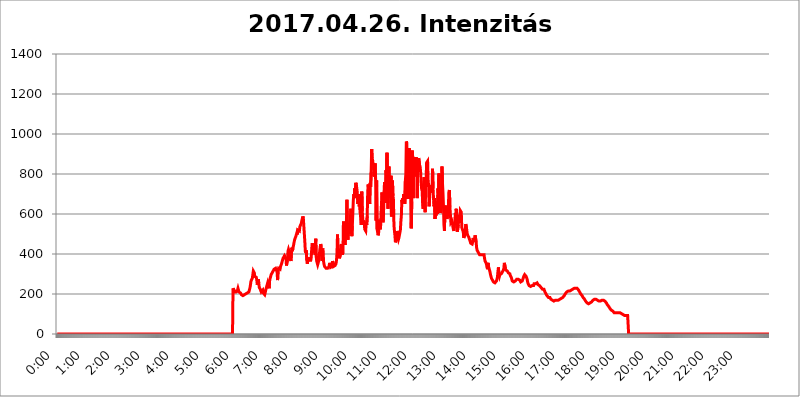
| Category | 2017.04.26. Intenzitás [W/m^2] |
|---|---|
| 0.0 | 0 |
| 0.0006944444444444445 | 0 |
| 0.001388888888888889 | 0 |
| 0.0020833333333333333 | 0 |
| 0.002777777777777778 | 0 |
| 0.003472222222222222 | 0 |
| 0.004166666666666667 | 0 |
| 0.004861111111111111 | 0 |
| 0.005555555555555556 | 0 |
| 0.0062499999999999995 | 0 |
| 0.006944444444444444 | 0 |
| 0.007638888888888889 | 0 |
| 0.008333333333333333 | 0 |
| 0.009027777777777779 | 0 |
| 0.009722222222222222 | 0 |
| 0.010416666666666666 | 0 |
| 0.011111111111111112 | 0 |
| 0.011805555555555555 | 0 |
| 0.012499999999999999 | 0 |
| 0.013194444444444444 | 0 |
| 0.013888888888888888 | 0 |
| 0.014583333333333332 | 0 |
| 0.015277777777777777 | 0 |
| 0.015972222222222224 | 0 |
| 0.016666666666666666 | 0 |
| 0.017361111111111112 | 0 |
| 0.018055555555555557 | 0 |
| 0.01875 | 0 |
| 0.019444444444444445 | 0 |
| 0.02013888888888889 | 0 |
| 0.020833333333333332 | 0 |
| 0.02152777777777778 | 0 |
| 0.022222222222222223 | 0 |
| 0.02291666666666667 | 0 |
| 0.02361111111111111 | 0 |
| 0.024305555555555556 | 0 |
| 0.024999999999999998 | 0 |
| 0.025694444444444447 | 0 |
| 0.02638888888888889 | 0 |
| 0.027083333333333334 | 0 |
| 0.027777777777777776 | 0 |
| 0.02847222222222222 | 0 |
| 0.029166666666666664 | 0 |
| 0.029861111111111113 | 0 |
| 0.030555555555555555 | 0 |
| 0.03125 | 0 |
| 0.03194444444444445 | 0 |
| 0.03263888888888889 | 0 |
| 0.03333333333333333 | 0 |
| 0.034027777777777775 | 0 |
| 0.034722222222222224 | 0 |
| 0.035416666666666666 | 0 |
| 0.036111111111111115 | 0 |
| 0.03680555555555556 | 0 |
| 0.0375 | 0 |
| 0.03819444444444444 | 0 |
| 0.03888888888888889 | 0 |
| 0.03958333333333333 | 0 |
| 0.04027777777777778 | 0 |
| 0.04097222222222222 | 0 |
| 0.041666666666666664 | 0 |
| 0.042361111111111106 | 0 |
| 0.04305555555555556 | 0 |
| 0.043750000000000004 | 0 |
| 0.044444444444444446 | 0 |
| 0.04513888888888889 | 0 |
| 0.04583333333333334 | 0 |
| 0.04652777777777778 | 0 |
| 0.04722222222222222 | 0 |
| 0.04791666666666666 | 0 |
| 0.04861111111111111 | 0 |
| 0.049305555555555554 | 0 |
| 0.049999999999999996 | 0 |
| 0.05069444444444445 | 0 |
| 0.051388888888888894 | 0 |
| 0.052083333333333336 | 0 |
| 0.05277777777777778 | 0 |
| 0.05347222222222222 | 0 |
| 0.05416666666666667 | 0 |
| 0.05486111111111111 | 0 |
| 0.05555555555555555 | 0 |
| 0.05625 | 0 |
| 0.05694444444444444 | 0 |
| 0.057638888888888885 | 0 |
| 0.05833333333333333 | 0 |
| 0.05902777777777778 | 0 |
| 0.059722222222222225 | 0 |
| 0.06041666666666667 | 0 |
| 0.061111111111111116 | 0 |
| 0.06180555555555556 | 0 |
| 0.0625 | 0 |
| 0.06319444444444444 | 0 |
| 0.06388888888888888 | 0 |
| 0.06458333333333334 | 0 |
| 0.06527777777777778 | 0 |
| 0.06597222222222222 | 0 |
| 0.06666666666666667 | 0 |
| 0.06736111111111111 | 0 |
| 0.06805555555555555 | 0 |
| 0.06874999999999999 | 0 |
| 0.06944444444444443 | 0 |
| 0.07013888888888889 | 0 |
| 0.07083333333333333 | 0 |
| 0.07152777777777779 | 0 |
| 0.07222222222222223 | 0 |
| 0.07291666666666667 | 0 |
| 0.07361111111111111 | 0 |
| 0.07430555555555556 | 0 |
| 0.075 | 0 |
| 0.07569444444444444 | 0 |
| 0.0763888888888889 | 0 |
| 0.07708333333333334 | 0 |
| 0.07777777777777778 | 0 |
| 0.07847222222222222 | 0 |
| 0.07916666666666666 | 0 |
| 0.0798611111111111 | 0 |
| 0.08055555555555556 | 0 |
| 0.08125 | 0 |
| 0.08194444444444444 | 0 |
| 0.08263888888888889 | 0 |
| 0.08333333333333333 | 0 |
| 0.08402777777777777 | 0 |
| 0.08472222222222221 | 0 |
| 0.08541666666666665 | 0 |
| 0.08611111111111112 | 0 |
| 0.08680555555555557 | 0 |
| 0.08750000000000001 | 0 |
| 0.08819444444444445 | 0 |
| 0.08888888888888889 | 0 |
| 0.08958333333333333 | 0 |
| 0.09027777777777778 | 0 |
| 0.09097222222222222 | 0 |
| 0.09166666666666667 | 0 |
| 0.09236111111111112 | 0 |
| 0.09305555555555556 | 0 |
| 0.09375 | 0 |
| 0.09444444444444444 | 0 |
| 0.09513888888888888 | 0 |
| 0.09583333333333333 | 0 |
| 0.09652777777777777 | 0 |
| 0.09722222222222222 | 0 |
| 0.09791666666666667 | 0 |
| 0.09861111111111111 | 0 |
| 0.09930555555555555 | 0 |
| 0.09999999999999999 | 0 |
| 0.10069444444444443 | 0 |
| 0.1013888888888889 | 0 |
| 0.10208333333333335 | 0 |
| 0.10277777777777779 | 0 |
| 0.10347222222222223 | 0 |
| 0.10416666666666667 | 0 |
| 0.10486111111111111 | 0 |
| 0.10555555555555556 | 0 |
| 0.10625 | 0 |
| 0.10694444444444444 | 0 |
| 0.1076388888888889 | 0 |
| 0.10833333333333334 | 0 |
| 0.10902777777777778 | 0 |
| 0.10972222222222222 | 0 |
| 0.1111111111111111 | 0 |
| 0.11180555555555556 | 0 |
| 0.11180555555555556 | 0 |
| 0.1125 | 0 |
| 0.11319444444444444 | 0 |
| 0.11388888888888889 | 0 |
| 0.11458333333333333 | 0 |
| 0.11527777777777777 | 0 |
| 0.11597222222222221 | 0 |
| 0.11666666666666665 | 0 |
| 0.1173611111111111 | 0 |
| 0.11805555555555557 | 0 |
| 0.11944444444444445 | 0 |
| 0.12013888888888889 | 0 |
| 0.12083333333333333 | 0 |
| 0.12152777777777778 | 0 |
| 0.12222222222222223 | 0 |
| 0.12291666666666667 | 0 |
| 0.12291666666666667 | 0 |
| 0.12361111111111112 | 0 |
| 0.12430555555555556 | 0 |
| 0.125 | 0 |
| 0.12569444444444444 | 0 |
| 0.12638888888888888 | 0 |
| 0.12708333333333333 | 0 |
| 0.16875 | 0 |
| 0.12847222222222224 | 0 |
| 0.12916666666666668 | 0 |
| 0.12986111111111112 | 0 |
| 0.13055555555555556 | 0 |
| 0.13125 | 0 |
| 0.13194444444444445 | 0 |
| 0.1326388888888889 | 0 |
| 0.13333333333333333 | 0 |
| 0.13402777777777777 | 0 |
| 0.13402777777777777 | 0 |
| 0.13472222222222222 | 0 |
| 0.13541666666666666 | 0 |
| 0.1361111111111111 | 0 |
| 0.13749999999999998 | 0 |
| 0.13819444444444443 | 0 |
| 0.1388888888888889 | 0 |
| 0.13958333333333334 | 0 |
| 0.14027777777777778 | 0 |
| 0.14097222222222222 | 0 |
| 0.14166666666666666 | 0 |
| 0.1423611111111111 | 0 |
| 0.14305555555555557 | 0 |
| 0.14375000000000002 | 0 |
| 0.14444444444444446 | 0 |
| 0.1451388888888889 | 0 |
| 0.1451388888888889 | 0 |
| 0.14652777777777778 | 0 |
| 0.14722222222222223 | 0 |
| 0.14791666666666667 | 0 |
| 0.1486111111111111 | 0 |
| 0.14930555555555555 | 0 |
| 0.15 | 0 |
| 0.15069444444444444 | 0 |
| 0.15138888888888888 | 0 |
| 0.15208333333333332 | 0 |
| 0.15277777777777776 | 0 |
| 0.15347222222222223 | 0 |
| 0.15416666666666667 | 0 |
| 0.15486111111111112 | 0 |
| 0.15555555555555556 | 0 |
| 0.15625 | 0 |
| 0.15694444444444444 | 0 |
| 0.15763888888888888 | 0 |
| 0.15833333333333333 | 0 |
| 0.15902777777777777 | 0 |
| 0.15972222222222224 | 0 |
| 0.16041666666666668 | 0 |
| 0.16111111111111112 | 0 |
| 0.16180555555555556 | 0 |
| 0.1625 | 0 |
| 0.16319444444444445 | 0 |
| 0.1638888888888889 | 0 |
| 0.16458333333333333 | 0 |
| 0.16527777777777777 | 0 |
| 0.16597222222222222 | 0 |
| 0.16666666666666666 | 0 |
| 0.1673611111111111 | 0 |
| 0.16805555555555554 | 0 |
| 0.16874999999999998 | 0 |
| 0.16944444444444443 | 0 |
| 0.17013888888888887 | 0 |
| 0.1708333333333333 | 0 |
| 0.17152777777777775 | 0 |
| 0.17222222222222225 | 0 |
| 0.1729166666666667 | 0 |
| 0.17361111111111113 | 0 |
| 0.17430555555555557 | 0 |
| 0.17500000000000002 | 0 |
| 0.17569444444444446 | 0 |
| 0.1763888888888889 | 0 |
| 0.17708333333333334 | 0 |
| 0.17777777777777778 | 0 |
| 0.17847222222222223 | 0 |
| 0.17916666666666667 | 0 |
| 0.1798611111111111 | 0 |
| 0.18055555555555555 | 0 |
| 0.18125 | 0 |
| 0.18194444444444444 | 0 |
| 0.1826388888888889 | 0 |
| 0.18333333333333335 | 0 |
| 0.1840277777777778 | 0 |
| 0.18472222222222223 | 0 |
| 0.18541666666666667 | 0 |
| 0.18611111111111112 | 0 |
| 0.18680555555555556 | 0 |
| 0.1875 | 0 |
| 0.18819444444444444 | 0 |
| 0.18888888888888888 | 0 |
| 0.18958333333333333 | 0 |
| 0.19027777777777777 | 0 |
| 0.1909722222222222 | 0 |
| 0.19166666666666665 | 0 |
| 0.19236111111111112 | 0 |
| 0.19305555555555554 | 0 |
| 0.19375 | 0 |
| 0.19444444444444445 | 0 |
| 0.1951388888888889 | 0 |
| 0.19583333333333333 | 0 |
| 0.19652777777777777 | 0 |
| 0.19722222222222222 | 0 |
| 0.19791666666666666 | 0 |
| 0.1986111111111111 | 0 |
| 0.19930555555555554 | 0 |
| 0.19999999999999998 | 0 |
| 0.20069444444444443 | 0 |
| 0.20138888888888887 | 0 |
| 0.2020833333333333 | 0 |
| 0.2027777777777778 | 0 |
| 0.2034722222222222 | 0 |
| 0.2041666666666667 | 0 |
| 0.20486111111111113 | 0 |
| 0.20555555555555557 | 0 |
| 0.20625000000000002 | 0 |
| 0.20694444444444446 | 0 |
| 0.2076388888888889 | 0 |
| 0.20833333333333334 | 0 |
| 0.20902777777777778 | 0 |
| 0.20972222222222223 | 0 |
| 0.21041666666666667 | 0 |
| 0.2111111111111111 | 0 |
| 0.21180555555555555 | 0 |
| 0.2125 | 0 |
| 0.21319444444444444 | 0 |
| 0.2138888888888889 | 0 |
| 0.21458333333333335 | 0 |
| 0.2152777777777778 | 0 |
| 0.21597222222222223 | 0 |
| 0.21666666666666667 | 0 |
| 0.21736111111111112 | 0 |
| 0.21805555555555556 | 0 |
| 0.21875 | 0 |
| 0.21944444444444444 | 0 |
| 0.22013888888888888 | 0 |
| 0.22083333333333333 | 0 |
| 0.22152777777777777 | 0 |
| 0.2222222222222222 | 0 |
| 0.22291666666666665 | 0 |
| 0.2236111111111111 | 0 |
| 0.22430555555555556 | 0 |
| 0.225 | 0 |
| 0.22569444444444445 | 0 |
| 0.2263888888888889 | 0 |
| 0.22708333333333333 | 0 |
| 0.22777777777777777 | 0 |
| 0.22847222222222222 | 0 |
| 0.22916666666666666 | 0 |
| 0.2298611111111111 | 0 |
| 0.23055555555555554 | 0 |
| 0.23124999999999998 | 0 |
| 0.23194444444444443 | 0 |
| 0.23263888888888887 | 0 |
| 0.2333333333333333 | 0 |
| 0.2340277777777778 | 0 |
| 0.2347222222222222 | 0 |
| 0.2354166666666667 | 0 |
| 0.23611111111111113 | 0 |
| 0.23680555555555557 | 0 |
| 0.23750000000000002 | 0 |
| 0.23819444444444446 | 0 |
| 0.2388888888888889 | 0 |
| 0.23958333333333334 | 0 |
| 0.24027777777777778 | 0 |
| 0.24097222222222223 | 0 |
| 0.24166666666666667 | 0 |
| 0.2423611111111111 | 0 |
| 0.24305555555555555 | 0 |
| 0.24375 | 0 |
| 0.24444444444444446 | 0 |
| 0.24513888888888888 | 0 |
| 0.24583333333333335 | 0 |
| 0.2465277777777778 | 228.436 |
| 0.24722222222222223 | 228.436 |
| 0.24791666666666667 | 219.309 |
| 0.24861111111111112 | 210.182 |
| 0.24930555555555556 | 205.62 |
| 0.25 | 205.62 |
| 0.25069444444444444 | 210.182 |
| 0.2513888888888889 | 210.182 |
| 0.2520833333333333 | 214.746 |
| 0.25277777777777777 | 219.309 |
| 0.2534722222222222 | 228.436 |
| 0.25416666666666665 | 219.309 |
| 0.2548611111111111 | 210.182 |
| 0.2555555555555556 | 210.182 |
| 0.25625000000000003 | 205.62 |
| 0.2569444444444445 | 205.62 |
| 0.2576388888888889 | 201.058 |
| 0.25833333333333336 | 196.497 |
| 0.2590277777777778 | 191.937 |
| 0.25972222222222224 | 191.937 |
| 0.2604166666666667 | 191.937 |
| 0.2611111111111111 | 196.497 |
| 0.26180555555555557 | 196.497 |
| 0.2625 | 196.497 |
| 0.26319444444444445 | 196.497 |
| 0.2638888888888889 | 201.058 |
| 0.26458333333333334 | 201.058 |
| 0.2652777777777778 | 201.058 |
| 0.2659722222222222 | 205.62 |
| 0.26666666666666666 | 205.62 |
| 0.2673611111111111 | 205.62 |
| 0.26805555555555555 | 210.182 |
| 0.26875 | 210.182 |
| 0.26944444444444443 | 219.309 |
| 0.2701388888888889 | 228.436 |
| 0.2708333333333333 | 242.127 |
| 0.27152777777777776 | 260.373 |
| 0.2722222222222222 | 269.49 |
| 0.27291666666666664 | 269.49 |
| 0.2736111111111111 | 278.603 |
| 0.2743055555555555 | 283.156 |
| 0.27499999999999997 | 314.98 |
| 0.27569444444444446 | 314.98 |
| 0.27638888888888885 | 305.898 |
| 0.27708333333333335 | 287.709 |
| 0.2777777777777778 | 283.156 |
| 0.27847222222222223 | 287.709 |
| 0.2791666666666667 | 283.156 |
| 0.2798611111111111 | 269.49 |
| 0.28055555555555556 | 246.689 |
| 0.28125 | 260.373 |
| 0.28194444444444444 | 274.047 |
| 0.2826388888888889 | 255.813 |
| 0.2833333333333333 | 233 |
| 0.28402777777777777 | 228.436 |
| 0.2847222222222222 | 223.873 |
| 0.28541666666666665 | 223.873 |
| 0.28611111111111115 | 210.182 |
| 0.28680555555555554 | 205.62 |
| 0.28750000000000003 | 210.182 |
| 0.2881944444444445 | 219.309 |
| 0.2888888888888889 | 205.62 |
| 0.28958333333333336 | 201.058 |
| 0.2902777777777778 | 210.182 |
| 0.29097222222222224 | 196.497 |
| 0.2916666666666667 | 205.62 |
| 0.2923611111111111 | 219.309 |
| 0.29305555555555557 | 228.436 |
| 0.29375 | 237.564 |
| 0.29444444444444445 | 246.689 |
| 0.2951388888888889 | 255.813 |
| 0.29583333333333334 | 246.689 |
| 0.2965277777777778 | 246.689 |
| 0.2972222222222222 | 228.436 |
| 0.29791666666666666 | 269.49 |
| 0.2986111111111111 | 274.047 |
| 0.29930555555555555 | 269.49 |
| 0.3 | 296.808 |
| 0.30069444444444443 | 301.354 |
| 0.3013888888888889 | 305.898 |
| 0.3020833333333333 | 310.44 |
| 0.30277777777777776 | 314.98 |
| 0.3034722222222222 | 319.517 |
| 0.30416666666666664 | 324.052 |
| 0.3048611111111111 | 324.052 |
| 0.3055555555555555 | 324.052 |
| 0.30624999999999997 | 328.584 |
| 0.3069444444444444 | 333.113 |
| 0.3076388888888889 | 333.113 |
| 0.30833333333333335 | 310.44 |
| 0.3090277777777778 | 269.49 |
| 0.30972222222222223 | 319.517 |
| 0.3104166666666667 | 328.584 |
| 0.3111111111111111 | 333.113 |
| 0.31180555555555556 | 333.113 |
| 0.3125 | 324.052 |
| 0.31319444444444444 | 337.639 |
| 0.3138888888888889 | 342.162 |
| 0.3145833333333333 | 351.198 |
| 0.31527777777777777 | 351.198 |
| 0.3159722222222222 | 369.23 |
| 0.31666666666666665 | 378.224 |
| 0.31736111111111115 | 382.715 |
| 0.31805555555555554 | 382.715 |
| 0.31875000000000003 | 391.685 |
| 0.3194444444444445 | 396.164 |
| 0.3201388888888889 | 387.202 |
| 0.32083333333333336 | 378.224 |
| 0.3215277777777778 | 342.162 |
| 0.32222222222222224 | 342.162 |
| 0.3229166666666667 | 373.729 |
| 0.3236111111111111 | 414.035 |
| 0.32430555555555557 | 422.943 |
| 0.325 | 414.035 |
| 0.32569444444444445 | 414.035 |
| 0.3263888888888889 | 396.164 |
| 0.32708333333333334 | 373.729 |
| 0.3277777777777778 | 364.728 |
| 0.3284722222222222 | 409.574 |
| 0.32916666666666666 | 431.833 |
| 0.3298611111111111 | 414.035 |
| 0.33055555555555555 | 431.833 |
| 0.33125 | 440.702 |
| 0.33194444444444443 | 445.129 |
| 0.3326388888888889 | 467.187 |
| 0.3333333333333333 | 475.972 |
| 0.3340277777777778 | 480.356 |
| 0.3347222222222222 | 489.108 |
| 0.3354166666666667 | 497.836 |
| 0.3361111111111111 | 506.542 |
| 0.3368055555555556 | 497.836 |
| 0.33749999999999997 | 519.555 |
| 0.33819444444444446 | 519.555 |
| 0.33888888888888885 | 519.555 |
| 0.33958333333333335 | 515.223 |
| 0.34027777777777773 | 536.82 |
| 0.34097222222222223 | 541.121 |
| 0.3416666666666666 | 536.82 |
| 0.3423611111111111 | 553.986 |
| 0.3430555555555555 | 566.793 |
| 0.34375 | 571.049 |
| 0.3444444444444445 | 588.009 |
| 0.3451388888888889 | 579.542 |
| 0.3458333333333334 | 579.542 |
| 0.34652777777777777 | 575.299 |
| 0.34722222222222227 | 462.786 |
| 0.34791666666666665 | 414.035 |
| 0.34861111111111115 | 405.108 |
| 0.34930555555555554 | 418.492 |
| 0.35000000000000003 | 369.23 |
| 0.3506944444444444 | 351.198 |
| 0.3513888888888889 | 364.728 |
| 0.3520833333333333 | 382.715 |
| 0.3527777777777778 | 387.202 |
| 0.3534722222222222 | 369.23 |
| 0.3541666666666667 | 364.728 |
| 0.3548611111111111 | 373.729 |
| 0.35555555555555557 | 369.23 |
| 0.35625 | 382.715 |
| 0.35694444444444445 | 427.39 |
| 0.3576388888888889 | 453.968 |
| 0.35833333333333334 | 436.27 |
| 0.3590277777777778 | 422.943 |
| 0.3597222222222222 | 440.702 |
| 0.36041666666666666 | 445.129 |
| 0.3611111111111111 | 405.108 |
| 0.36180555555555555 | 396.164 |
| 0.3625 | 475.972 |
| 0.36319444444444443 | 387.202 |
| 0.3638888888888889 | 364.728 |
| 0.3645833333333333 | 355.712 |
| 0.3652777777777778 | 346.682 |
| 0.3659722222222222 | 346.682 |
| 0.3666666666666667 | 351.198 |
| 0.3673611111111111 | 373.729 |
| 0.3680555555555556 | 414.035 |
| 0.36874999999999997 | 431.833 |
| 0.36944444444444446 | 449.551 |
| 0.37013888888888885 | 440.702 |
| 0.37083333333333335 | 400.638 |
| 0.37152777777777773 | 364.728 |
| 0.37222222222222223 | 427.39 |
| 0.3729166666666666 | 405.108 |
| 0.3736111111111111 | 360.221 |
| 0.3743055555555555 | 346.682 |
| 0.375 | 337.639 |
| 0.3756944444444445 | 342.162 |
| 0.3763888888888889 | 337.639 |
| 0.3770833333333334 | 328.584 |
| 0.37777777777777777 | 333.113 |
| 0.37847222222222227 | 333.113 |
| 0.37916666666666665 | 328.584 |
| 0.37986111111111115 | 333.113 |
| 0.38055555555555554 | 333.113 |
| 0.38125000000000003 | 337.639 |
| 0.3819444444444444 | 355.712 |
| 0.3826388888888889 | 342.162 |
| 0.3833333333333333 | 333.113 |
| 0.3840277777777778 | 333.113 |
| 0.3847222222222222 | 337.639 |
| 0.3854166666666667 | 337.639 |
| 0.3861111111111111 | 364.728 |
| 0.38680555555555557 | 355.712 |
| 0.3875 | 337.639 |
| 0.38819444444444445 | 342.162 |
| 0.3888888888888889 | 342.162 |
| 0.38958333333333334 | 342.162 |
| 0.3902777777777778 | 346.682 |
| 0.3909722222222222 | 351.198 |
| 0.39166666666666666 | 369.23 |
| 0.3923611111111111 | 405.108 |
| 0.39305555555555555 | 497.836 |
| 0.39375 | 431.833 |
| 0.39444444444444443 | 422.943 |
| 0.3951388888888889 | 396.164 |
| 0.3958333333333333 | 378.224 |
| 0.3965277777777778 | 373.729 |
| 0.3972222222222222 | 400.638 |
| 0.3979166666666667 | 440.702 |
| 0.3986111111111111 | 449.551 |
| 0.3993055555555556 | 453.968 |
| 0.39999999999999997 | 396.164 |
| 0.40069444444444446 | 409.574 |
| 0.40138888888888885 | 562.53 |
| 0.40208333333333335 | 458.38 |
| 0.40277777777777773 | 532.513 |
| 0.40347222222222223 | 445.129 |
| 0.4041666666666666 | 449.551 |
| 0.4048611111111111 | 440.702 |
| 0.4055555555555555 | 558.261 |
| 0.40625 | 671.22 |
| 0.4069444444444445 | 549.704 |
| 0.4076388888888889 | 471.582 |
| 0.4083333333333334 | 510.885 |
| 0.40902777777777777 | 536.82 |
| 0.40972222222222227 | 502.192 |
| 0.41041666666666665 | 553.986 |
| 0.41111111111111115 | 566.793 |
| 0.41180555555555554 | 625.784 |
| 0.41250000000000003 | 519.555 |
| 0.4131944444444444 | 489.108 |
| 0.4138888888888889 | 541.121 |
| 0.4145833333333333 | 536.82 |
| 0.4152777777777778 | 671.22 |
| 0.4159722222222222 | 699.717 |
| 0.4166666666666667 | 679.395 |
| 0.4173611111111111 | 727.896 |
| 0.41805555555555557 | 707.8 |
| 0.41875 | 755.766 |
| 0.41944444444444445 | 747.834 |
| 0.4201388888888889 | 727.896 |
| 0.42083333333333334 | 707.8 |
| 0.4215277777777778 | 650.667 |
| 0.4222222222222222 | 675.311 |
| 0.42291666666666666 | 699.717 |
| 0.4236111111111111 | 638.256 |
| 0.42430555555555555 | 658.909 |
| 0.425 | 604.864 |
| 0.42569444444444443 | 575.299 |
| 0.4263888888888889 | 545.416 |
| 0.4270833333333333 | 711.832 |
| 0.4277777777777778 | 613.252 |
| 0.4284722222222222 | 579.542 |
| 0.4291666666666667 | 545.416 |
| 0.4298611111111111 | 566.793 |
| 0.4305555555555556 | 553.986 |
| 0.43124999999999997 | 523.88 |
| 0.43194444444444446 | 519.555 |
| 0.43263888888888885 | 515.223 |
| 0.43333333333333335 | 558.261 |
| 0.43402777777777773 | 545.416 |
| 0.43472222222222223 | 588.009 |
| 0.4354166666666666 | 707.8 |
| 0.4361111111111111 | 747.834 |
| 0.4368055555555555 | 747.834 |
| 0.4375 | 691.608 |
| 0.4381944444444445 | 650.667 |
| 0.4388888888888889 | 755.766 |
| 0.4395833333333334 | 735.89 |
| 0.44027777777777777 | 810.641 |
| 0.44097222222222227 | 925.06 |
| 0.44166666666666665 | 879.719 |
| 0.44236111111111115 | 868.305 |
| 0.44305555555555554 | 845.365 |
| 0.44375000000000003 | 853.029 |
| 0.4444444444444444 | 787.258 |
| 0.4451388888888889 | 802.868 |
| 0.4458333333333333 | 853.029 |
| 0.4465277777777778 | 775.492 |
| 0.4472222222222222 | 566.793 |
| 0.4479166666666667 | 767.62 |
| 0.4486111111111111 | 523.88 |
| 0.44930555555555557 | 523.88 |
| 0.45 | 493.475 |
| 0.45069444444444445 | 502.192 |
| 0.4513888888888889 | 558.261 |
| 0.45208333333333334 | 571.049 |
| 0.4527777777777778 | 523.88 |
| 0.4534722222222222 | 532.513 |
| 0.45416666666666666 | 609.062 |
| 0.4548611111111111 | 604.864 |
| 0.45555555555555555 | 707.8 |
| 0.45625 | 596.45 |
| 0.45694444444444443 | 558.261 |
| 0.4576388888888889 | 604.864 |
| 0.4583333333333333 | 707.8 |
| 0.4590277777777778 | 759.723 |
| 0.4597222222222222 | 735.89 |
| 0.4604166666666667 | 654.791 |
| 0.4611111111111111 | 818.392 |
| 0.4618055555555556 | 798.974 |
| 0.46249999999999997 | 906.223 |
| 0.46319444444444446 | 775.492 |
| 0.46388888888888885 | 625.784 |
| 0.46458333333333335 | 735.89 |
| 0.46527777777777773 | 837.682 |
| 0.46597222222222223 | 679.395 |
| 0.4666666666666666 | 775.492 |
| 0.4673611111111111 | 695.666 |
| 0.4680555555555555 | 791.169 |
| 0.46875 | 588.009 |
| 0.4694444444444445 | 650.667 |
| 0.4701388888888889 | 767.62 |
| 0.4708333333333334 | 691.608 |
| 0.47152777777777777 | 671.22 |
| 0.47222222222222227 | 545.416 |
| 0.47291666666666665 | 515.223 |
| 0.47361111111111115 | 493.475 |
| 0.47430555555555554 | 458.38 |
| 0.47500000000000003 | 462.786 |
| 0.4756944444444444 | 475.972 |
| 0.4763888888888889 | 515.223 |
| 0.4770833333333333 | 510.885 |
| 0.4777777777777778 | 480.356 |
| 0.4784722222222222 | 471.582 |
| 0.4791666666666667 | 480.356 |
| 0.4798611111111111 | 484.735 |
| 0.48055555555555557 | 506.542 |
| 0.48125 | 519.555 |
| 0.48194444444444445 | 562.53 |
| 0.4826388888888889 | 592.233 |
| 0.48333333333333334 | 671.22 |
| 0.4840277777777778 | 658.909 |
| 0.4847222222222222 | 679.395 |
| 0.48541666666666666 | 663.019 |
| 0.4861111111111111 | 699.717 |
| 0.48680555555555555 | 675.311 |
| 0.4875 | 650.667 |
| 0.48819444444444443 | 763.674 |
| 0.4888888888888889 | 798.974 |
| 0.4895833333333333 | 962.555 |
| 0.4902777777777778 | 955.071 |
| 0.4909722222222222 | 691.608 |
| 0.4916666666666667 | 675.311 |
| 0.4923611111111111 | 798.974 |
| 0.4930555555555556 | 731.896 |
| 0.49374999999999997 | 928.819 |
| 0.49444444444444446 | 791.169 |
| 0.49513888888888885 | 675.311 |
| 0.49583333333333335 | 791.169 |
| 0.49652777777777773 | 528.2 |
| 0.49722222222222223 | 663.019 |
| 0.4979166666666666 | 917.534 |
| 0.4986111111111111 | 879.719 |
| 0.4993055555555555 | 679.395 |
| 0.5 | 883.516 |
| 0.5006944444444444 | 787.258 |
| 0.5013888888888889 | 860.676 |
| 0.5020833333333333 | 875.918 |
| 0.5027777777777778 | 868.305 |
| 0.5034722222222222 | 883.516 |
| 0.5041666666666667 | 860.676 |
| 0.5048611111111111 | 679.395 |
| 0.5055555555555555 | 856.855 |
| 0.50625 | 860.676 |
| 0.5069444444444444 | 879.719 |
| 0.5076388888888889 | 875.918 |
| 0.5083333333333333 | 841.526 |
| 0.5090277777777777 | 833.834 |
| 0.5097222222222222 | 806.757 |
| 0.5104166666666666 | 751.803 |
| 0.5111111111111112 | 723.889 |
| 0.5118055555555555 | 715.858 |
| 0.5125000000000001 | 650.667 |
| 0.5131944444444444 | 625.784 |
| 0.513888888888889 | 751.803 |
| 0.5145833333333333 | 783.342 |
| 0.5152777777777778 | 642.4 |
| 0.5159722222222222 | 609.062 |
| 0.5166666666666667 | 743.859 |
| 0.517361111111111 | 779.42 |
| 0.5180555555555556 | 856.855 |
| 0.5187499999999999 | 860.676 |
| 0.5194444444444445 | 864.493 |
| 0.5201388888888888 | 771.559 |
| 0.5208333333333334 | 739.877 |
| 0.5215277777777778 | 638.256 |
| 0.5222222222222223 | 675.311 |
| 0.5229166666666667 | 723.889 |
| 0.5236111111111111 | 743.859 |
| 0.5243055555555556 | 747.834 |
| 0.525 | 707.8 |
| 0.5256944444444445 | 739.877 |
| 0.5263888888888889 | 826.123 |
| 0.5270833333333333 | 727.896 |
| 0.5277777777777778 | 675.311 |
| 0.5284722222222222 | 638.256 |
| 0.5291666666666667 | 679.395 |
| 0.5298611111111111 | 575.299 |
| 0.5305555555555556 | 621.613 |
| 0.53125 | 592.233 |
| 0.5319444444444444 | 650.667 |
| 0.5326388888888889 | 663.019 |
| 0.5333333333333333 | 600.661 |
| 0.5340277777777778 | 727.896 |
| 0.5347222222222222 | 699.717 |
| 0.5354166666666667 | 802.868 |
| 0.5361111111111111 | 638.256 |
| 0.5368055555555555 | 638.256 |
| 0.5375 | 604.864 |
| 0.5381944444444444 | 617.436 |
| 0.5388888888888889 | 646.537 |
| 0.5395833333333333 | 837.682 |
| 0.5402777777777777 | 755.766 |
| 0.5409722222222222 | 707.8 |
| 0.5416666666666666 | 642.4 |
| 0.5423611111111112 | 545.416 |
| 0.5430555555555555 | 515.223 |
| 0.5437500000000001 | 629.948 |
| 0.5444444444444444 | 625.784 |
| 0.545138888888889 | 642.4 |
| 0.5458333333333333 | 638.256 |
| 0.5465277777777778 | 575.299 |
| 0.5472222222222222 | 588.009 |
| 0.5479166666666667 | 621.613 |
| 0.548611111111111 | 642.4 |
| 0.5493055555555556 | 711.832 |
| 0.5499999999999999 | 719.877 |
| 0.5506944444444445 | 638.256 |
| 0.5513888888888888 | 642.4 |
| 0.5520833333333334 | 558.261 |
| 0.5527777777777778 | 558.261 |
| 0.5534722222222223 | 566.793 |
| 0.5541666666666667 | 558.261 |
| 0.5548611111111111 | 536.82 |
| 0.5555555555555556 | 523.88 |
| 0.55625 | 515.223 |
| 0.5569444444444445 | 541.121 |
| 0.5576388888888889 | 558.261 |
| 0.5583333333333333 | 604.864 |
| 0.5590277777777778 | 579.542 |
| 0.5597222222222222 | 625.784 |
| 0.5604166666666667 | 545.416 |
| 0.5611111111111111 | 510.885 |
| 0.5618055555555556 | 515.223 |
| 0.5625 | 545.416 |
| 0.5631944444444444 | 596.45 |
| 0.5638888888888889 | 579.542 |
| 0.5645833333333333 | 588.009 |
| 0.5652777777777778 | 617.436 |
| 0.5659722222222222 | 613.252 |
| 0.5666666666666667 | 609.062 |
| 0.5673611111111111 | 532.513 |
| 0.5680555555555555 | 532.513 |
| 0.56875 | 528.2 |
| 0.5694444444444444 | 510.885 |
| 0.5701388888888889 | 480.356 |
| 0.5708333333333333 | 475.972 |
| 0.5715277777777777 | 480.356 |
| 0.5722222222222222 | 502.192 |
| 0.5729166666666666 | 549.704 |
| 0.5736111111111112 | 553.986 |
| 0.5743055555555555 | 519.555 |
| 0.5750000000000001 | 502.192 |
| 0.5756944444444444 | 493.475 |
| 0.576388888888889 | 497.836 |
| 0.5770833333333333 | 484.735 |
| 0.5777777777777778 | 489.108 |
| 0.5784722222222222 | 480.356 |
| 0.5791666666666667 | 462.786 |
| 0.579861111111111 | 453.968 |
| 0.5805555555555556 | 453.968 |
| 0.5812499999999999 | 449.551 |
| 0.5819444444444445 | 449.551 |
| 0.5826388888888888 | 458.38 |
| 0.5833333333333334 | 480.356 |
| 0.5840277777777778 | 475.972 |
| 0.5847222222222223 | 462.786 |
| 0.5854166666666667 | 475.972 |
| 0.5861111111111111 | 493.475 |
| 0.5868055555555556 | 497.836 |
| 0.5875 | 458.38 |
| 0.5881944444444445 | 431.833 |
| 0.5888888888888889 | 418.492 |
| 0.5895833333333333 | 418.492 |
| 0.5902777777777778 | 414.035 |
| 0.5909722222222222 | 405.108 |
| 0.5916666666666667 | 400.638 |
| 0.5923611111111111 | 396.164 |
| 0.5930555555555556 | 396.164 |
| 0.59375 | 396.164 |
| 0.5944444444444444 | 396.164 |
| 0.5951388888888889 | 391.685 |
| 0.5958333333333333 | 391.685 |
| 0.5965277777777778 | 396.164 |
| 0.5972222222222222 | 396.164 |
| 0.5979166666666667 | 400.638 |
| 0.5986111111111111 | 396.164 |
| 0.5993055555555555 | 378.224 |
| 0.6 | 364.728 |
| 0.6006944444444444 | 360.221 |
| 0.6013888888888889 | 355.712 |
| 0.6020833333333333 | 346.682 |
| 0.6027777777777777 | 333.113 |
| 0.6034722222222222 | 324.052 |
| 0.6041666666666666 | 355.712 |
| 0.6048611111111112 | 337.639 |
| 0.6055555555555555 | 328.584 |
| 0.6062500000000001 | 319.517 |
| 0.6069444444444444 | 310.44 |
| 0.607638888888889 | 296.808 |
| 0.6083333333333333 | 287.709 |
| 0.6090277777777778 | 278.603 |
| 0.6097222222222222 | 274.047 |
| 0.6104166666666667 | 269.49 |
| 0.611111111111111 | 264.932 |
| 0.6118055555555556 | 260.373 |
| 0.6124999999999999 | 260.373 |
| 0.6131944444444445 | 255.813 |
| 0.6138888888888888 | 255.813 |
| 0.6145833333333334 | 260.373 |
| 0.6152777777777778 | 260.373 |
| 0.6159722222222223 | 264.932 |
| 0.6166666666666667 | 269.49 |
| 0.6173611111111111 | 283.156 |
| 0.6180555555555556 | 310.44 |
| 0.61875 | 333.113 |
| 0.6194444444444445 | 296.808 |
| 0.6201388888888889 | 287.709 |
| 0.6208333333333333 | 296.808 |
| 0.6215277777777778 | 301.354 |
| 0.6222222222222222 | 301.354 |
| 0.6229166666666667 | 301.354 |
| 0.6236111111111111 | 301.354 |
| 0.6243055555555556 | 310.44 |
| 0.625 | 314.98 |
| 0.6256944444444444 | 319.517 |
| 0.6263888888888889 | 328.584 |
| 0.6270833333333333 | 355.712 |
| 0.6277777777777778 | 360.221 |
| 0.6284722222222222 | 328.584 |
| 0.6291666666666667 | 319.517 |
| 0.6298611111111111 | 314.98 |
| 0.6305555555555555 | 319.517 |
| 0.63125 | 314.98 |
| 0.6319444444444444 | 314.98 |
| 0.6326388888888889 | 305.898 |
| 0.6333333333333333 | 301.354 |
| 0.6340277777777777 | 301.354 |
| 0.6347222222222222 | 301.354 |
| 0.6354166666666666 | 292.259 |
| 0.6361111111111112 | 292.259 |
| 0.6368055555555555 | 283.156 |
| 0.6375000000000001 | 274.047 |
| 0.6381944444444444 | 264.932 |
| 0.638888888888889 | 264.932 |
| 0.6395833333333333 | 260.373 |
| 0.6402777777777778 | 260.373 |
| 0.6409722222222222 | 260.373 |
| 0.6416666666666667 | 260.373 |
| 0.642361111111111 | 264.932 |
| 0.6430555555555556 | 269.49 |
| 0.6437499999999999 | 269.49 |
| 0.6444444444444445 | 274.047 |
| 0.6451388888888888 | 278.603 |
| 0.6458333333333334 | 278.603 |
| 0.6465277777777778 | 274.047 |
| 0.6472222222222223 | 274.047 |
| 0.6479166666666667 | 274.047 |
| 0.6486111111111111 | 269.49 |
| 0.6493055555555556 | 264.932 |
| 0.65 | 260.373 |
| 0.6506944444444445 | 260.373 |
| 0.6513888888888889 | 260.373 |
| 0.6520833333333333 | 264.932 |
| 0.6527777777777778 | 269.49 |
| 0.6534722222222222 | 278.603 |
| 0.6541666666666667 | 287.709 |
| 0.6548611111111111 | 292.259 |
| 0.6555555555555556 | 296.808 |
| 0.65625 | 296.808 |
| 0.6569444444444444 | 292.259 |
| 0.6576388888888889 | 287.709 |
| 0.6583333333333333 | 283.156 |
| 0.6590277777777778 | 274.047 |
| 0.6597222222222222 | 260.373 |
| 0.6604166666666667 | 251.251 |
| 0.6611111111111111 | 246.689 |
| 0.6618055555555555 | 242.127 |
| 0.6625 | 237.564 |
| 0.6631944444444444 | 237.564 |
| 0.6638888888888889 | 237.564 |
| 0.6645833333333333 | 233 |
| 0.6652777777777777 | 233 |
| 0.6659722222222222 | 242.127 |
| 0.6666666666666666 | 242.127 |
| 0.6673611111111111 | 242.127 |
| 0.6680555555555556 | 242.127 |
| 0.6687500000000001 | 251.251 |
| 0.6694444444444444 | 246.689 |
| 0.6701388888888888 | 251.251 |
| 0.6708333333333334 | 251.251 |
| 0.6715277777777778 | 251.251 |
| 0.6722222222222222 | 255.813 |
| 0.6729166666666666 | 255.813 |
| 0.6736111111111112 | 251.251 |
| 0.6743055555555556 | 246.689 |
| 0.6749999999999999 | 246.689 |
| 0.6756944444444444 | 242.127 |
| 0.6763888888888889 | 242.127 |
| 0.6770833333333334 | 242.127 |
| 0.6777777777777777 | 237.564 |
| 0.6784722222222223 | 233 |
| 0.6791666666666667 | 233 |
| 0.6798611111111111 | 228.436 |
| 0.6805555555555555 | 223.873 |
| 0.68125 | 219.309 |
| 0.6819444444444445 | 223.873 |
| 0.6826388888888889 | 223.873 |
| 0.6833333333333332 | 219.309 |
| 0.6840277777777778 | 210.182 |
| 0.6847222222222222 | 210.182 |
| 0.6854166666666667 | 201.058 |
| 0.686111111111111 | 196.497 |
| 0.6868055555555556 | 191.937 |
| 0.6875 | 187.378 |
| 0.6881944444444444 | 187.378 |
| 0.688888888888889 | 182.82 |
| 0.6895833333333333 | 182.82 |
| 0.6902777777777778 | 178.264 |
| 0.6909722222222222 | 182.82 |
| 0.6916666666666668 | 178.264 |
| 0.6923611111111111 | 173.709 |
| 0.6930555555555555 | 173.709 |
| 0.69375 | 169.156 |
| 0.6944444444444445 | 169.156 |
| 0.6951388888888889 | 169.156 |
| 0.6958333333333333 | 169.156 |
| 0.6965277777777777 | 164.605 |
| 0.6972222222222223 | 169.156 |
| 0.6979166666666666 | 169.156 |
| 0.6986111111111111 | 169.156 |
| 0.6993055555555556 | 169.156 |
| 0.7000000000000001 | 169.156 |
| 0.7006944444444444 | 169.156 |
| 0.7013888888888888 | 169.156 |
| 0.7020833333333334 | 169.156 |
| 0.7027777777777778 | 169.156 |
| 0.7034722222222222 | 173.709 |
| 0.7041666666666666 | 173.709 |
| 0.7048611111111112 | 173.709 |
| 0.7055555555555556 | 173.709 |
| 0.7062499999999999 | 178.264 |
| 0.7069444444444444 | 178.264 |
| 0.7076388888888889 | 182.82 |
| 0.7083333333333334 | 182.82 |
| 0.7090277777777777 | 182.82 |
| 0.7097222222222223 | 187.378 |
| 0.7104166666666667 | 187.378 |
| 0.7111111111111111 | 191.937 |
| 0.7118055555555555 | 196.497 |
| 0.7125 | 201.058 |
| 0.7131944444444445 | 201.058 |
| 0.7138888888888889 | 205.62 |
| 0.7145833333333332 | 210.182 |
| 0.7152777777777778 | 210.182 |
| 0.7159722222222222 | 210.182 |
| 0.7166666666666667 | 214.746 |
| 0.717361111111111 | 214.746 |
| 0.7180555555555556 | 214.746 |
| 0.71875 | 214.746 |
| 0.7194444444444444 | 214.746 |
| 0.720138888888889 | 219.309 |
| 0.7208333333333333 | 219.309 |
| 0.7215277777777778 | 219.309 |
| 0.7222222222222222 | 219.309 |
| 0.7229166666666668 | 223.873 |
| 0.7236111111111111 | 223.873 |
| 0.7243055555555555 | 223.873 |
| 0.725 | 228.436 |
| 0.7256944444444445 | 228.436 |
| 0.7263888888888889 | 228.436 |
| 0.7270833333333333 | 228.436 |
| 0.7277777777777777 | 228.436 |
| 0.7284722222222223 | 228.436 |
| 0.7291666666666666 | 228.436 |
| 0.7298611111111111 | 223.873 |
| 0.7305555555555556 | 223.873 |
| 0.7312500000000001 | 219.309 |
| 0.7319444444444444 | 214.746 |
| 0.7326388888888888 | 210.182 |
| 0.7333333333333334 | 205.62 |
| 0.7340277777777778 | 201.058 |
| 0.7347222222222222 | 201.058 |
| 0.7354166666666666 | 196.497 |
| 0.7361111111111112 | 191.937 |
| 0.7368055555555556 | 187.378 |
| 0.7374999999999999 | 182.82 |
| 0.7381944444444444 | 182.82 |
| 0.7388888888888889 | 178.264 |
| 0.7395833333333334 | 173.709 |
| 0.7402777777777777 | 169.156 |
| 0.7409722222222223 | 164.605 |
| 0.7416666666666667 | 164.605 |
| 0.7423611111111111 | 160.056 |
| 0.7430555555555555 | 155.509 |
| 0.74375 | 155.509 |
| 0.7444444444444445 | 150.964 |
| 0.7451388888888889 | 150.964 |
| 0.7458333333333332 | 150.964 |
| 0.7465277777777778 | 150.964 |
| 0.7472222222222222 | 155.509 |
| 0.7479166666666667 | 155.509 |
| 0.748611111111111 | 155.509 |
| 0.7493055555555556 | 160.056 |
| 0.75 | 164.605 |
| 0.7506944444444444 | 164.605 |
| 0.751388888888889 | 169.156 |
| 0.7520833333333333 | 169.156 |
| 0.7527777777777778 | 169.156 |
| 0.7534722222222222 | 173.709 |
| 0.7541666666666668 | 173.709 |
| 0.7548611111111111 | 173.709 |
| 0.7555555555555555 | 173.709 |
| 0.75625 | 173.709 |
| 0.7569444444444445 | 169.156 |
| 0.7576388888888889 | 169.156 |
| 0.7583333333333333 | 169.156 |
| 0.7590277777777777 | 169.156 |
| 0.7597222222222223 | 164.605 |
| 0.7604166666666666 | 164.605 |
| 0.7611111111111111 | 164.605 |
| 0.7618055555555556 | 164.605 |
| 0.7625000000000001 | 164.605 |
| 0.7631944444444444 | 169.156 |
| 0.7638888888888888 | 169.156 |
| 0.7645833333333334 | 169.156 |
| 0.7652777777777778 | 169.156 |
| 0.7659722222222222 | 169.156 |
| 0.7666666666666666 | 164.605 |
| 0.7673611111111112 | 164.605 |
| 0.7680555555555556 | 164.605 |
| 0.7687499999999999 | 160.056 |
| 0.7694444444444444 | 160.056 |
| 0.7701388888888889 | 155.509 |
| 0.7708333333333334 | 150.964 |
| 0.7715277777777777 | 146.423 |
| 0.7722222222222223 | 146.423 |
| 0.7729166666666667 | 141.884 |
| 0.7736111111111111 | 137.347 |
| 0.7743055555555555 | 132.814 |
| 0.775 | 128.284 |
| 0.7756944444444445 | 128.284 |
| 0.7763888888888889 | 123.758 |
| 0.7770833333333332 | 119.235 |
| 0.7777777777777778 | 119.235 |
| 0.7784722222222222 | 114.716 |
| 0.7791666666666667 | 114.716 |
| 0.779861111111111 | 110.201 |
| 0.7805555555555556 | 110.201 |
| 0.78125 | 105.69 |
| 0.7819444444444444 | 105.69 |
| 0.782638888888889 | 105.69 |
| 0.7833333333333333 | 105.69 |
| 0.7840277777777778 | 105.69 |
| 0.7847222222222222 | 105.69 |
| 0.7854166666666668 | 105.69 |
| 0.7861111111111111 | 105.69 |
| 0.7868055555555555 | 105.69 |
| 0.7875 | 105.69 |
| 0.7881944444444445 | 105.69 |
| 0.7888888888888889 | 105.69 |
| 0.7895833333333333 | 105.69 |
| 0.7902777777777777 | 101.184 |
| 0.7909722222222223 | 101.184 |
| 0.7916666666666666 | 101.184 |
| 0.7923611111111111 | 96.682 |
| 0.7930555555555556 | 96.682 |
| 0.7937500000000001 | 96.682 |
| 0.7944444444444444 | 92.184 |
| 0.7951388888888888 | 92.184 |
| 0.7958333333333334 | 92.184 |
| 0.7965277777777778 | 92.184 |
| 0.7972222222222222 | 92.184 |
| 0.7979166666666666 | 92.184 |
| 0.7986111111111112 | 92.184 |
| 0.7993055555555556 | 92.184 |
| 0.7999999999999999 | 92.184 |
| 0.8006944444444444 | 87.692 |
| 0.8013888888888889 | 0 |
| 0.8020833333333334 | 0 |
| 0.8027777777777777 | 0 |
| 0.8034722222222223 | 0 |
| 0.8041666666666667 | 0 |
| 0.8048611111111111 | 0 |
| 0.8055555555555555 | 0 |
| 0.80625 | 0 |
| 0.8069444444444445 | 0 |
| 0.8076388888888889 | 0 |
| 0.8083333333333332 | 0 |
| 0.8090277777777778 | 0 |
| 0.8097222222222222 | 0 |
| 0.8104166666666667 | 0 |
| 0.811111111111111 | 0 |
| 0.8118055555555556 | 0 |
| 0.8125 | 0 |
| 0.8131944444444444 | 0 |
| 0.813888888888889 | 0 |
| 0.8145833333333333 | 0 |
| 0.8152777777777778 | 0 |
| 0.8159722222222222 | 0 |
| 0.8166666666666668 | 0 |
| 0.8173611111111111 | 0 |
| 0.8180555555555555 | 0 |
| 0.81875 | 0 |
| 0.8194444444444445 | 0 |
| 0.8201388888888889 | 0 |
| 0.8208333333333333 | 0 |
| 0.8215277777777777 | 0 |
| 0.8222222222222223 | 0 |
| 0.8229166666666666 | 0 |
| 0.8236111111111111 | 0 |
| 0.8243055555555556 | 0 |
| 0.8250000000000001 | 0 |
| 0.8256944444444444 | 0 |
| 0.8263888888888888 | 0 |
| 0.8270833333333334 | 0 |
| 0.8277777777777778 | 0 |
| 0.8284722222222222 | 0 |
| 0.8291666666666666 | 0 |
| 0.8298611111111112 | 0 |
| 0.8305555555555556 | 0 |
| 0.8312499999999999 | 0 |
| 0.8319444444444444 | 0 |
| 0.8326388888888889 | 0 |
| 0.8333333333333334 | 0 |
| 0.8340277777777777 | 0 |
| 0.8347222222222223 | 0 |
| 0.8354166666666667 | 0 |
| 0.8361111111111111 | 0 |
| 0.8368055555555555 | 0 |
| 0.8375 | 0 |
| 0.8381944444444445 | 0 |
| 0.8388888888888889 | 0 |
| 0.8395833333333332 | 0 |
| 0.8402777777777778 | 0 |
| 0.8409722222222222 | 0 |
| 0.8416666666666667 | 0 |
| 0.842361111111111 | 0 |
| 0.8430555555555556 | 0 |
| 0.84375 | 0 |
| 0.8444444444444444 | 0 |
| 0.845138888888889 | 0 |
| 0.8458333333333333 | 0 |
| 0.8465277777777778 | 0 |
| 0.8472222222222222 | 0 |
| 0.8479166666666668 | 0 |
| 0.8486111111111111 | 0 |
| 0.8493055555555555 | 0 |
| 0.85 | 0 |
| 0.8506944444444445 | 0 |
| 0.8513888888888889 | 0 |
| 0.8520833333333333 | 0 |
| 0.8527777777777777 | 0 |
| 0.8534722222222223 | 0 |
| 0.8541666666666666 | 0 |
| 0.8548611111111111 | 0 |
| 0.8555555555555556 | 0 |
| 0.8562500000000001 | 0 |
| 0.8569444444444444 | 0 |
| 0.8576388888888888 | 0 |
| 0.8583333333333334 | 0 |
| 0.8590277777777778 | 0 |
| 0.8597222222222222 | 0 |
| 0.8604166666666666 | 0 |
| 0.8611111111111112 | 0 |
| 0.8618055555555556 | 0 |
| 0.8624999999999999 | 0 |
| 0.8631944444444444 | 0 |
| 0.8638888888888889 | 0 |
| 0.8645833333333334 | 0 |
| 0.8652777777777777 | 0 |
| 0.8659722222222223 | 0 |
| 0.8666666666666667 | 0 |
| 0.8673611111111111 | 0 |
| 0.8680555555555555 | 0 |
| 0.86875 | 0 |
| 0.8694444444444445 | 0 |
| 0.8701388888888889 | 0 |
| 0.8708333333333332 | 0 |
| 0.8715277777777778 | 0 |
| 0.8722222222222222 | 0 |
| 0.8729166666666667 | 0 |
| 0.873611111111111 | 0 |
| 0.8743055555555556 | 0 |
| 0.875 | 0 |
| 0.8756944444444444 | 0 |
| 0.876388888888889 | 0 |
| 0.8770833333333333 | 0 |
| 0.8777777777777778 | 0 |
| 0.8784722222222222 | 0 |
| 0.8791666666666668 | 0 |
| 0.8798611111111111 | 0 |
| 0.8805555555555555 | 0 |
| 0.88125 | 0 |
| 0.8819444444444445 | 0 |
| 0.8826388888888889 | 0 |
| 0.8833333333333333 | 0 |
| 0.8840277777777777 | 0 |
| 0.8847222222222223 | 0 |
| 0.8854166666666666 | 0 |
| 0.8861111111111111 | 0 |
| 0.8868055555555556 | 0 |
| 0.8875000000000001 | 0 |
| 0.8881944444444444 | 0 |
| 0.8888888888888888 | 0 |
| 0.8895833333333334 | 0 |
| 0.8902777777777778 | 0 |
| 0.8909722222222222 | 0 |
| 0.8916666666666666 | 0 |
| 0.8923611111111112 | 0 |
| 0.8930555555555556 | 0 |
| 0.8937499999999999 | 0 |
| 0.8944444444444444 | 0 |
| 0.8951388888888889 | 0 |
| 0.8958333333333334 | 0 |
| 0.8965277777777777 | 0 |
| 0.8972222222222223 | 0 |
| 0.8979166666666667 | 0 |
| 0.8986111111111111 | 0 |
| 0.8993055555555555 | 0 |
| 0.9 | 0 |
| 0.9006944444444445 | 0 |
| 0.9013888888888889 | 0 |
| 0.9020833333333332 | 0 |
| 0.9027777777777778 | 0 |
| 0.9034722222222222 | 0 |
| 0.9041666666666667 | 0 |
| 0.904861111111111 | 0 |
| 0.9055555555555556 | 0 |
| 0.90625 | 0 |
| 0.9069444444444444 | 0 |
| 0.907638888888889 | 0 |
| 0.9083333333333333 | 0 |
| 0.9090277777777778 | 0 |
| 0.9097222222222222 | 0 |
| 0.9104166666666668 | 0 |
| 0.9111111111111111 | 0 |
| 0.9118055555555555 | 0 |
| 0.9125 | 0 |
| 0.9131944444444445 | 0 |
| 0.9138888888888889 | 0 |
| 0.9145833333333333 | 0 |
| 0.9152777777777777 | 0 |
| 0.9159722222222223 | 0 |
| 0.9166666666666666 | 0 |
| 0.9173611111111111 | 0 |
| 0.9180555555555556 | 0 |
| 0.9187500000000001 | 0 |
| 0.9194444444444444 | 0 |
| 0.9201388888888888 | 0 |
| 0.9208333333333334 | 0 |
| 0.9215277777777778 | 0 |
| 0.9222222222222222 | 0 |
| 0.9229166666666666 | 0 |
| 0.9236111111111112 | 0 |
| 0.9243055555555556 | 0 |
| 0.9249999999999999 | 0 |
| 0.9256944444444444 | 0 |
| 0.9263888888888889 | 0 |
| 0.9270833333333334 | 0 |
| 0.9277777777777777 | 0 |
| 0.9284722222222223 | 0 |
| 0.9291666666666667 | 0 |
| 0.9298611111111111 | 0 |
| 0.9305555555555555 | 0 |
| 0.93125 | 0 |
| 0.9319444444444445 | 0 |
| 0.9326388888888889 | 0 |
| 0.9333333333333332 | 0 |
| 0.9340277777777778 | 0 |
| 0.9347222222222222 | 0 |
| 0.9354166666666667 | 0 |
| 0.936111111111111 | 0 |
| 0.9368055555555556 | 0 |
| 0.9375 | 0 |
| 0.9381944444444444 | 0 |
| 0.938888888888889 | 0 |
| 0.9395833333333333 | 0 |
| 0.9402777777777778 | 0 |
| 0.9409722222222222 | 0 |
| 0.9416666666666668 | 0 |
| 0.9423611111111111 | 0 |
| 0.9430555555555555 | 0 |
| 0.94375 | 0 |
| 0.9444444444444445 | 0 |
| 0.9451388888888889 | 0 |
| 0.9458333333333333 | 0 |
| 0.9465277777777777 | 0 |
| 0.9472222222222223 | 0 |
| 0.9479166666666666 | 0 |
| 0.9486111111111111 | 0 |
| 0.9493055555555556 | 0 |
| 0.9500000000000001 | 0 |
| 0.9506944444444444 | 0 |
| 0.9513888888888888 | 0 |
| 0.9520833333333334 | 0 |
| 0.9527777777777778 | 0 |
| 0.9534722222222222 | 0 |
| 0.9541666666666666 | 0 |
| 0.9548611111111112 | 0 |
| 0.9555555555555556 | 0 |
| 0.9562499999999999 | 0 |
| 0.9569444444444444 | 0 |
| 0.9576388888888889 | 0 |
| 0.9583333333333334 | 0 |
| 0.9590277777777777 | 0 |
| 0.9597222222222223 | 0 |
| 0.9604166666666667 | 0 |
| 0.9611111111111111 | 0 |
| 0.9618055555555555 | 0 |
| 0.9625 | 0 |
| 0.9631944444444445 | 0 |
| 0.9638888888888889 | 0 |
| 0.9645833333333332 | 0 |
| 0.9652777777777778 | 0 |
| 0.9659722222222222 | 0 |
| 0.9666666666666667 | 0 |
| 0.967361111111111 | 0 |
| 0.9680555555555556 | 0 |
| 0.96875 | 0 |
| 0.9694444444444444 | 0 |
| 0.970138888888889 | 0 |
| 0.9708333333333333 | 0 |
| 0.9715277777777778 | 0 |
| 0.9722222222222222 | 0 |
| 0.9729166666666668 | 0 |
| 0.9736111111111111 | 0 |
| 0.9743055555555555 | 0 |
| 0.975 | 0 |
| 0.9756944444444445 | 0 |
| 0.9763888888888889 | 0 |
| 0.9770833333333333 | 0 |
| 0.9777777777777777 | 0 |
| 0.9784722222222223 | 0 |
| 0.9791666666666666 | 0 |
| 0.9798611111111111 | 0 |
| 0.9805555555555556 | 0 |
| 0.9812500000000001 | 0 |
| 0.9819444444444444 | 0 |
| 0.9826388888888888 | 0 |
| 0.9833333333333334 | 0 |
| 0.9840277777777778 | 0 |
| 0.9847222222222222 | 0 |
| 0.9854166666666666 | 0 |
| 0.9861111111111112 | 0 |
| 0.9868055555555556 | 0 |
| 0.9874999999999999 | 0 |
| 0.9881944444444444 | 0 |
| 0.9888888888888889 | 0 |
| 0.9895833333333334 | 0 |
| 0.9902777777777777 | 0 |
| 0.9909722222222223 | 0 |
| 0.9916666666666667 | 0 |
| 0.9923611111111111 | 0 |
| 0.9930555555555555 | 0 |
| 0.99375 | 0 |
| 0.9944444444444445 | 0 |
| 0.9951388888888889 | 0 |
| 0.9958333333333332 | 0 |
| 0.9965277777777778 | 0 |
| 0.9972222222222222 | 0 |
| 0.9979166666666667 | 0 |
| 0.998611111111111 | 0 |
| 0.9993055555555556 | 0 |